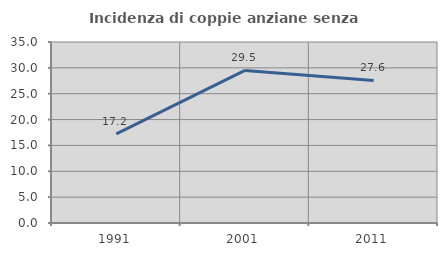
| Category | Incidenza di coppie anziane senza figli  |
|---|---|
| 1991.0 | 17.241 |
| 2001.0 | 29.5 |
| 2011.0 | 27.564 |